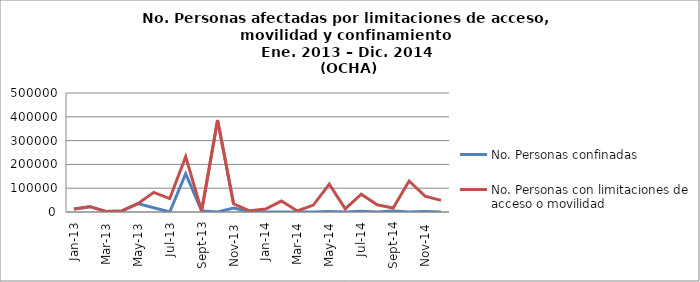
| Category | No. Personas confinadas | No. Personas con limitaciones de acceso o movilidad |
|---|---|---|
| 2013-01-01 | 12975 | 12975 |
| 2013-02-01 | 22432 | 22432 |
| 2013-03-01 | 2545 | 2545 |
| 2013-04-01 | 4575 | 4725 |
| 2013-05-01 | 35136 | 35138 |
| 2013-06-01 | 18015 | 82507 |
| 2013-07-01 | 0 | 56322 |
| 2013-08-01 | 161054 | 232265 |
| 2013-09-01 | 4167 | 4167 |
| 2013-10-01 | 250 | 386739 |
| 2013-11-01 | 16769 | 34595 |
| 2013-12-01 | 2057 | 5057 |
| 2014-01-01 | 0 | 12579 |
| 2014-02-01 | 245 | 46070 |
| 2014-03-01 | 0 | 4458 |
| 2014-04-01 | 0 | 29196 |
| 2014-05-01 | 2531 | 117049 |
| 2014-06-01 | 0 | 12942 |
| 2014-07-01 | 3621 | 74636 |
| 2014-08-01 | 0 | 30065 |
| 2014-09-01 | 3674 | 16948 |
| 2014-10-01 | 0 | 130231 |
| 2014-11-01 | 2000 | 66894 |
| 2014-12-01 | 0 | 48832 |